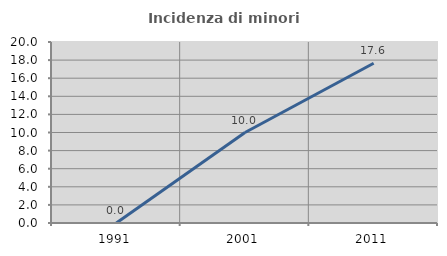
| Category | Incidenza di minori stranieri |
|---|---|
| 1991.0 | 0 |
| 2001.0 | 10 |
| 2011.0 | 17.647 |